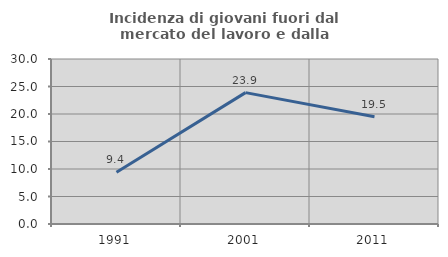
| Category | Incidenza di giovani fuori dal mercato del lavoro e dalla formazione  |
|---|---|
| 1991.0 | 9.424 |
| 2001.0 | 23.885 |
| 2011.0 | 19.497 |